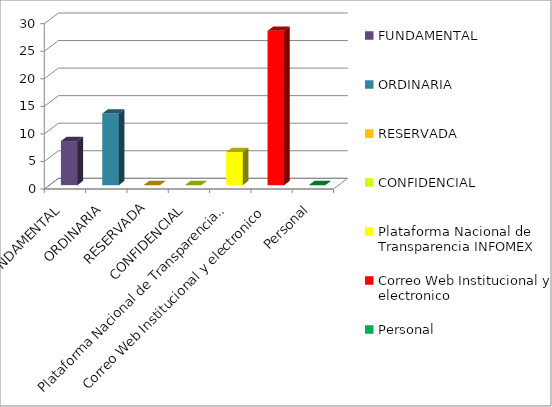
| Category | Series 2 |
|---|---|
| FUNDAMENTAL | 8 |
| ORDINARIA | 13 |
| RESERVADA | 0 |
| CONFIDENCIAL | 0 |
| Plataforma Nacional de Transparencia INFOMEX | 6 |
| Correo Web Institucional y electronico | 28 |
| Personal | 0 |